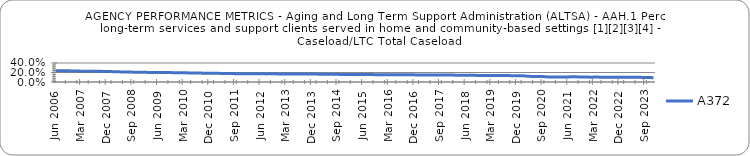
| Category | A372 |
|---|---|
| 0.76721 | 0.239 |
| 0.76724 | 0.239 |
| 0.76937 | 0.238 |
| 0.77188 | 0.237 |
| 0.77291 | 0.236 |
| 0.77287 | 0.235 |
| 0.77281 | 0.233 |
| 0.77321 | 0.233 |
| 0.77487 | 0.231 |
| 0.77588 | 0.228 |
| 0.77547 | 0.227 |
| 0.77665 | 0.227 |
| 0.77799 | 0.227 |
| 0.78001 | 0.227 |
| 0.78165 | 0.225 |
| 0.78378 | 0.224 |
| 0.78567 | 0.225 |
| 0.78719 | 0.223 |
| 0.7887 | 0.222 |
| 0.79022 | 0.22 |
| 0.79129 | 0.218 |
| 0.79193 | 0.216 |
| 0.79455 | 0.214 |
| 0.79439 | 0.213 |
| 0.79457 | 0.211 |
| 0.79632 | 0.21 |
| 0.79721 | 0.209 |
| 0.79865 | 0.208 |
| 0.79917 | 0.205 |
| 0.79965 | 0.206 |
| 0.79991 | 0.205 |
| 0.80036 | 0.204 |
| 0.80119 | 0.203 |
| 0.80135 | 0.201 |
| 0.80196 | 0.201 |
| 0.80282 | 0.2 |
| 0.80375 | 0.2 |
| 0.80441 | 0.2 |
| 0.80454 | 0.199 |
| 0.80574 | 0.199 |
| 0.80717 | 0.198 |
| 0.80907 | 0.197 |
| 0.80996 | 0.196 |
| 0.81048 | 0.196 |
| 0.81132 | 0.195 |
| 0.81235 | 0.194 |
| 0.81422 | 0.193 |
| 0.81521 | 0.191 |
| 0.81511 | 0.19 |
| 0.816 | 0.19 |
| 0.81562 | 0.189 |
| 0.8177 | 0.188 |
| 0.81902 | 0.186 |
| 0.81999 | 0.185 |
| 0.8202 | 0.185 |
| 0.82092 | 0.184 |
| 0.82336 | 0.184 |
| 0.82379 | 0.182 |
| 0.82545 | 0.181 |
| 0.82578 | 0.18 |
| 0.82632 | 0.18 |
| 0.82543 | 0.179 |
| 0.82484 | 0.177 |
| 0.82636 | 0.176 |
| 0.82733 | 0.175 |
| 0.82838 | 0.174 |
| 0.82888 | 0.174 |
| 0.82809 | 0.175 |
| 0.82917 | 0.175 |
| 0.82866 | 0.174 |
| 0.82858 | 0.173 |
| 0.82802 | 0.172 |
| 0.82938 | 0.171 |
| 0.83046 | 0.172 |
| 0.83086 | 0.171 |
| 0.83171 | 0.171 |
| 0.83162 | 0.171 |
| 0.83156 | 0.172 |
| 0.8309 | 0.171 |
| 0.83222 | 0.17 |
| 0.83276 | 0.169 |
| 0.83338 | 0.168 |
| 0.83336 | 0.168 |
| 0.83239 | 0.168 |
| 0.83251 | 0.169 |
| 0.8337 | 0.168 |
| 0.83426 | 0.167 |
| 0.83557 | 0.167 |
| 0.83627 | 0.167 |
| 0.83614 | 0.168 |
| 0.83597 | 0.167 |
| 0.83796 | 0.166 |
| 0.83821 | 0.166 |
| 0.83855 | 0.164 |
| 0.84014 | 0.164 |
| 0.83995 | 0.164 |
| 0.84007 | 0.164 |
| 0.8402 | 0.162 |
| 0.841 | 0.162 |
| 0.8424 | 0.161 |
| 0.8431 | 0.16 |
| 0.8435 | 0.16 |
| 0.8439 | 0.16 |
| 0.84383 | 0.16 |
| 0.84463 | 0.159 |
| 0.84443 | 0.158 |
| 0.84487 | 0.157 |
| 0.84543 | 0.157 |
| 0.8466 | 0.156 |
| 0.84682 | 0.156 |
| 0.84816 | 0.155 |
| 0.84589 | 0.156 |
| 0.84646 | 0.155 |
| 0.84772 | 0.155 |
| 0.8486 | 0.153 |
| 0.84786 | 0.153 |
| 0.84849 | 0.152 |
| 0.84851 | 0.154 |
| 0.8492 | 0.154 |
| 0.84852 | 0.152 |
| 0.84989 | 0.151 |
| 0.85076 | 0.152 |
| 0.85196 | 0.152 |
| 0.8534 | 0.151 |
| 0.85355 | 0.151 |
| 0.85326 | 0.151 |
| 0.85294 | 0.15 |
| 0.85119 | 0.149 |
| 0.85152 | 0.148 |
| 0.85143 | 0.147 |
| 0.85182 | 0.146 |
| 0.8521 | 0.147 |
| 0.85264 | 0.147 |
| 0.85441 | 0.149 |
| 0.85526 | 0.148 |
| 0.85728 | 0.149 |
| 0.8577 | 0.148 |
| 0.85845 | 0.148 |
| 0.85828 | 0.147 |
| 0.85799 | 0.146 |
| 0.85772 | 0.145 |
| 0.85887 | 0.143 |
| 0.86116 | 0.142 |
| 0.86123 | 0.142 |
| 0.86193 | 0.142 |
| 0.86372 | 0.142 |
| 0.86147 | 0.142 |
| 0.86303 | 0.141 |
| 0.86431 | 0.139 |
| 0.86533 | 0.139 |
| 0.86473 | 0.138 |
| 0.86411 | 0.136 |
| 0.86504 | 0.139 |
| 0.86518 | 0.137 |
| 0.86641 | 0.136 |
| 0.86717 | 0.135 |
| 0.86792 | 0.135 |
| 0.8694 | 0.136 |
| 0.86921 | 0.135 |
| 0.87375 | 0.135 |
| 0.87927 | 0.134 |
| 0.88196 | 0.133 |
| 0.8826 | 0.132 |
| 0.88378 | 0.131 |
| 0.88511 | 0.131 |
| 0.8857 | 0.126 |
| 0.88923 | 0.121 |
| 0.89424 | 0.118 |
| 0.89466 | 0.117 |
| 0.89512 | 0.116 |
| 0.89475 | 0.115 |
| 0.89525 | 0.114 |
| 0.89485 | 0.111 |
| 0.89346 | 0.106 |
| 0.89386 | 0.105 |
| 0.89048 | 0.105 |
| 0.89013 | 0.105 |
| 0.89185 | 0.105 |
| 0.8934 | 0.105 |
| 0.89298 | 0.107 |
| 0.89372 | 0.106 |
| 0.89661 | 0.11 |
| 0.89824 | 0.11 |
| 0.89708 | 0.108 |
| 0.89662 | 0.107 |
| 0.89759 | 0.107 |
| 0.89814 | 0.106 |
| 0.89823 | 0.103 |
| 0.89819 | 0.102 |
| 0.89789 | 0.103 |
| 0.89829 | 0.103 |
| 0.89874 | 0.102 |
| 0.90061 | 0.102 |
| 0.90125 | 0.102 |
| 0.90115 | 0.102 |
| 0.90196 | 0.102 |
| 0.90133 | 0.102 |
| 0.90135 | 0.101 |
| 0.90118 | 0.099 |
| 0.90219 | 0.099 |
| 0.90296 | 0.099 |
| 0.90356 | 0.098 |
| 0.90607 | 0.099 |
| 0.90755 | 0.099 |
| 0.91023 | 0.099 |
| nan | 0.098 |
| nan | 0.097 |
| nan | 0.096 |
| nan | 0.094 |
| nan | 0.092 |
| nan | 0.09 |